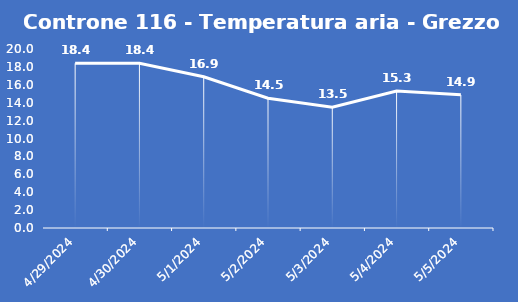
| Category | Controne 116 - Temperatura aria - Grezzo (°C) |
|---|---|
| 4/29/24 | 18.4 |
| 4/30/24 | 18.4 |
| 5/1/24 | 16.9 |
| 5/2/24 | 14.5 |
| 5/3/24 | 13.5 |
| 5/4/24 | 15.3 |
| 5/5/24 | 14.9 |